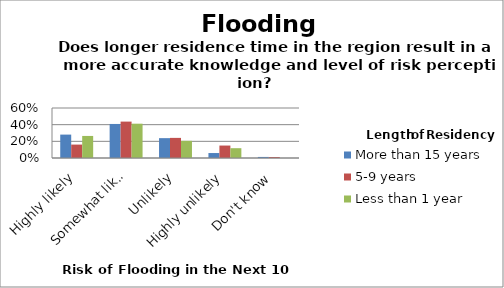
| Category | More than 15 years | 5-9 years | Less than 1 year |
|---|---|---|---|
| Highly likely | 0.281 | 0.161 | 0.265 |
| Somewhat likely | 0.409 | 0.437 | 0.412 |
| Unlikely | 0.238 | 0.241 | 0.206 |
| Highly unlikely | 0.06 | 0.149 | 0.118 |
| Don't know | 0.013 | 0.011 | 0 |